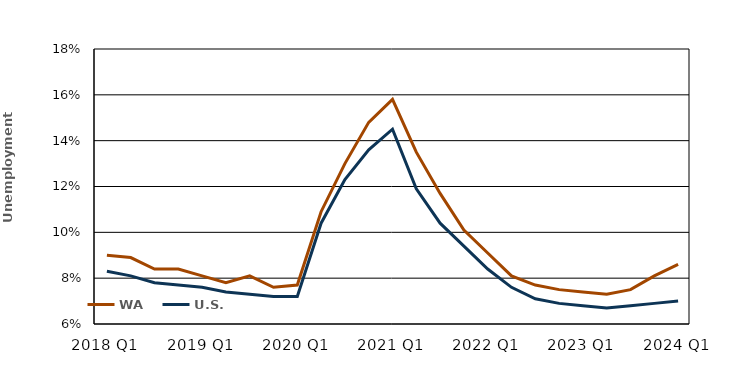
| Category | WA | U.S. |
|---|---|---|
| 2018 Q1 | 0.09 | 0.083 |
| 2018 Q2 | 0.089 | 0.081 |
| 2018 Q3 | 0.084 | 0.078 |
| 2018 Annual | 0.084 | 0.077 |
| 2019 Q1 | 0.081 | 0.076 |
| 2019 Q2 | 0.078 | 0.074 |
| 2019 Q3 | 0.081 | 0.073 |
| 2019 Annual | 0.076 | 0.072 |
| 2020 Q1 | 0.077 | 0.072 |
| 2020 Q2 | 0.109 | 0.104 |
| 2020 Q3 | 0.13 | 0.123 |
| 2020 Annual | 0.148 | 0.136 |
| 2021 Q1 | 0.158 | 0.145 |
| 2021 Q2 | 0.135 | 0.119 |
| 2021 Q3 | 0.117 | 0.104 |
| 2021 Annual | 0.101 | 0.094 |
| 2022 Q1 | 0.091 | 0.084 |
| 2022 Q2 | 0.081 | 0.076 |
| 2022 Q3 | 0.077 | 0.071 |
| 2022 Annual | 0.075 | 0.069 |
| 2023 Q1 | 0.074 | 0.068 |
| 2023 Q2 | 0.073 | 0.067 |
| 2023 Q3 | 0.075 | 0.068 |
| 2023 Annual | 0.081 | 0.069 |
| 2024 Q1 | 0.086 | 0.07 |